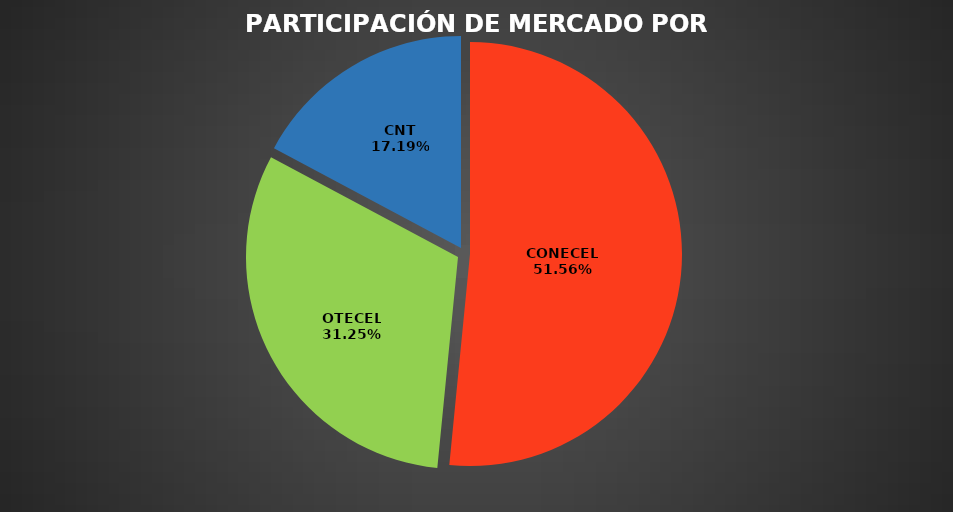
| Category | Oct 2022 |
|---|---|
| CONECEL | 8938600 |
| OTECEL | 5418229 |
| CNT | 2980969 |